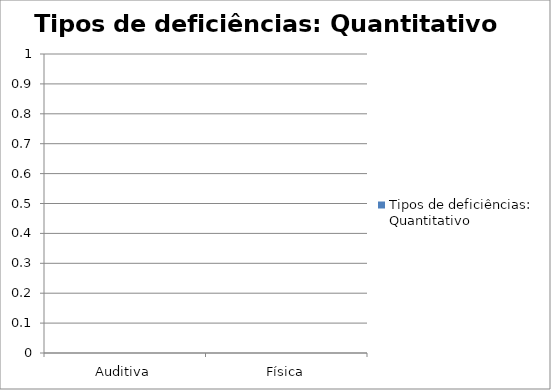
| Category | Tipos de deficiências: Quantitativo |
|---|---|
| Auditiva | 0 |
| Física | 0 |